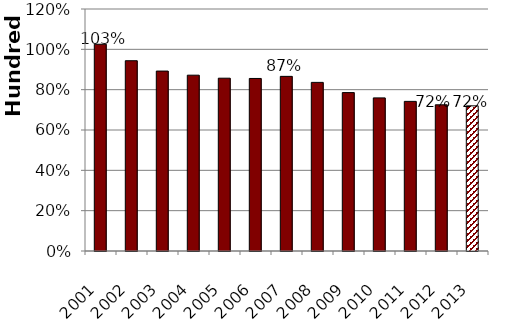
| Category | Act Funded Ratio |
|---|---|
| 2001.0 | 102.524 |
| 2002.0 | 94.349 |
| 2003.0 | 89.221 |
| 2004.0 | 87.181 |
| 2005.0 | 85.692 |
| 2006.0 | 85.556 |
| 2007.0 | 86.594 |
| 2008.0 | 83.611 |
| 2009.0 | 78.547 |
| 2010.0 | 75.928 |
| 2011.0 | 74.187 |
| 2012.0 | 72.484 |
| 2013.0 | 71.971 |